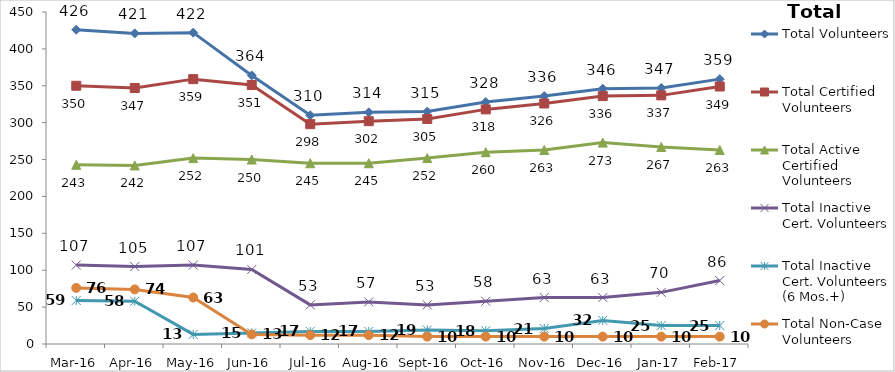
| Category | Total Volunteers | Total Certified Volunteers | Total Active Certified Volunteers | Total Inactive Cert. Volunteers | Total Inactive Cert. Volunteers (6 Mos.+) | Total Non-Case Volunteers |
|---|---|---|---|---|---|---|
| Mar-16 | 426 | 350 | 243 | 107 | 59 | 76 |
| Apr-16 | 421 | 347 | 242 | 105 | 58 | 74 |
| May-16 | 422 | 359 | 252 | 107 | 13 | 63 |
| Jun-16 | 364 | 351 | 250 | 101 | 15 | 13 |
| Jul-16 | 310 | 298 | 245 | 53 | 17 | 12 |
| Aug-16 | 314 | 302 | 245 | 57 | 17 | 12 |
| Sep-16 | 315 | 305 | 252 | 53 | 19 | 10 |
| Oct-16 | 328 | 318 | 260 | 58 | 18 | 10 |
| Nov-16 | 336 | 326 | 263 | 63 | 21 | 10 |
| Dec-16 | 346 | 336 | 273 | 63 | 32 | 10 |
| Jan-17 | 347 | 337 | 267 | 70 | 25 | 10 |
| Feb-17 | 359 | 349 | 263 | 86 | 25 | 10 |